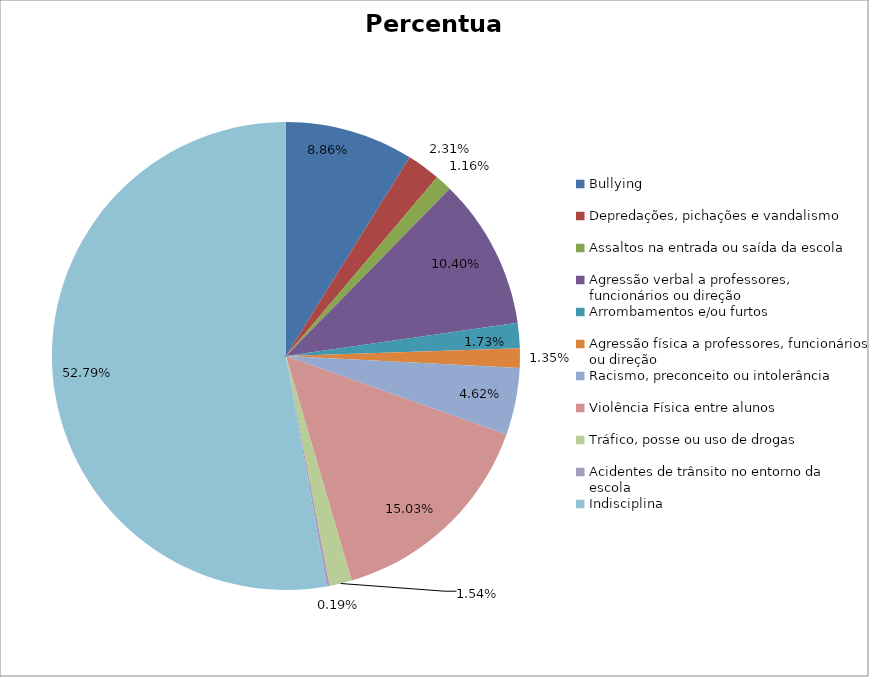
| Category | Percentual |
|---|---|
| Bullying | 0.089 |
| Depredações, pichações e vandalismo | 0.023 |
| Assaltos na entrada ou saída da escola | 0.012 |
| Agressão verbal a professores, funcionários ou direção | 0.104 |
| Arrombamentos e/ou furtos | 0.017 |
| Agressão física a professores, funcionários ou direção | 0.013 |
| Racismo, preconceito ou intolerância | 0.046 |
| Violência Física entre alunos | 0.15 |
| Tráfico, posse ou uso de drogas | 0.015 |
| Acidentes de trânsito no entorno da escola | 0.002 |
| Indisciplina | 0.528 |